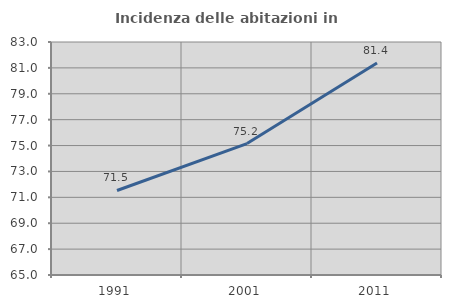
| Category | Incidenza delle abitazioni in proprietà  |
|---|---|
| 1991.0 | 71.53 |
| 2001.0 | 75.153 |
| 2011.0 | 81.373 |